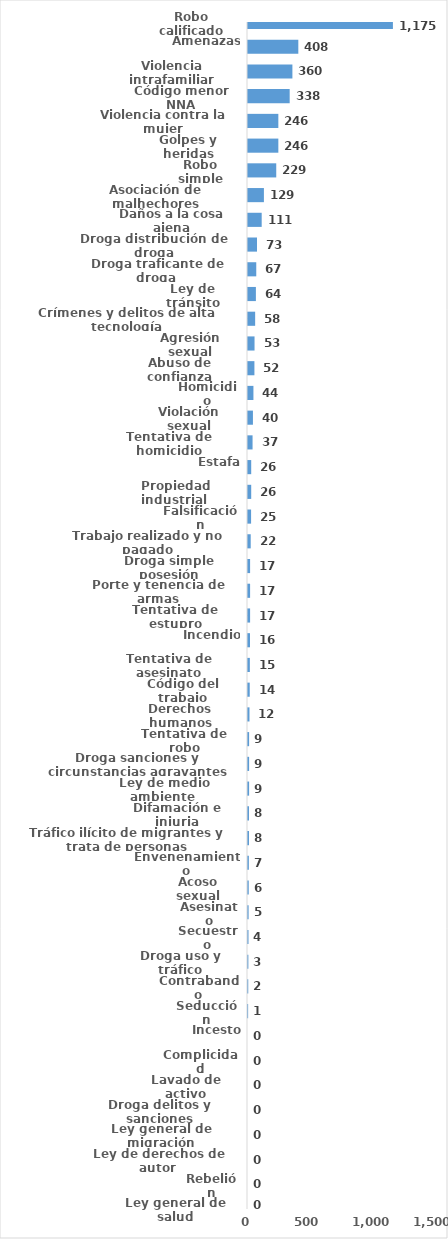
| Category | Series 0 |
|---|---|
| Robo calificado | 1175 |
| Amenazas | 408 |
| Violencia intrafamiliar | 360 |
| Código menor NNA | 338 |
| Violencia contra la mujer | 246 |
| Golpes y heridas | 246 |
| Robo simple | 229 |
| Asociación de malhechores | 129 |
| Daños a la cosa ajena | 111 |
| Droga distribución de droga | 73 |
| Droga traficante de droga  | 67 |
| Ley de tránsito | 64 |
| Crímenes y delitos de alta tecnología | 58 |
| Agresión sexual | 53 |
| Abuso de confianza | 52 |
| Homicidio | 44 |
| Violación sexual | 40 |
| Tentativa de homicidio | 37 |
| Estafa | 26 |
| Propiedad industrial  | 26 |
| Falsificación | 25 |
| Trabajo realizado y no pagado | 22 |
| Droga simple posesión | 17 |
| Porte y tenencia de armas | 17 |
| Tentativa de estupro | 17 |
| Incendio | 16 |
| Tentativa de asesinato | 15 |
| Código del trabajo | 14 |
| Derechos humanos | 12 |
| Tentativa de robo | 9 |
| Droga sanciones y circunstancias agravantes | 9 |
| Ley de medio ambiente  | 9 |
| Difamación e injuria | 8 |
| Tráfico ilícito de migrantes y trata de personas | 8 |
| Envenenamiento | 7 |
| Acoso sexual | 6 |
| Asesinato | 5 |
| Secuestro | 4 |
| Droga uso y tráfico | 3 |
| Contrabando | 2 |
| Seducción | 1 |
| Incesto | 0 |
| Complicidad | 0 |
| Lavado de activo | 0 |
| Droga delitos y sanciones | 0 |
| Ley general de migración | 0 |
| Ley de derechos de autor  | 0 |
| Rebelión | 0 |
| Ley general de salud | 0 |